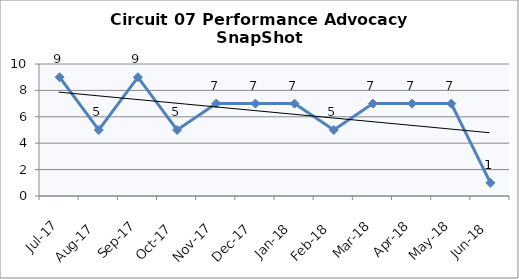
| Category | Circuit 07 |
|---|---|
| Jul-17 | 9 |
| Aug-17 | 5 |
| Sep-17 | 9 |
| Oct-17 | 5 |
| Nov-17 | 7 |
| Dec-17 | 7 |
| Jan-18 | 7 |
| Feb-18 | 5 |
| Mar-18 | 7 |
| Apr-18 | 7 |
| May-18 | 7 |
| Jun-18 | 1 |